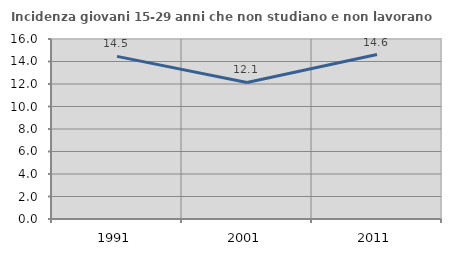
| Category | Incidenza giovani 15-29 anni che non studiano e non lavorano  |
|---|---|
| 1991.0 | 14.453 |
| 2001.0 | 12.139 |
| 2011.0 | 14.615 |